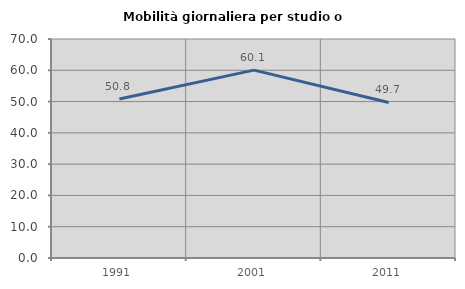
| Category | Mobilità giornaliera per studio o lavoro |
|---|---|
| 1991.0 | 50.816 |
| 2001.0 | 60.057 |
| 2011.0 | 49.719 |